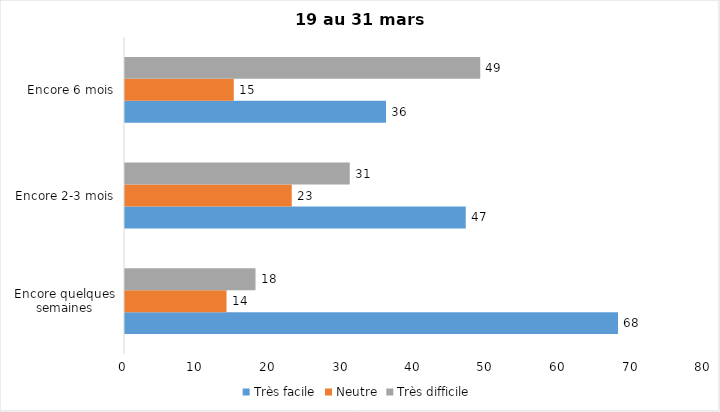
| Category | Très facile | Neutre | Très difficile |
|---|---|---|---|
| Encore quelques semaines | 68 | 14 | 18 |
| Encore 2-3 mois | 47 | 23 | 31 |
| Encore 6 mois | 36 | 15 | 49 |